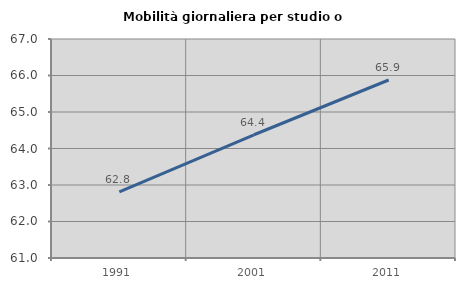
| Category | Mobilità giornaliera per studio o lavoro |
|---|---|
| 1991.0 | 62.81 |
| 2001.0 | 64.377 |
| 2011.0 | 65.877 |